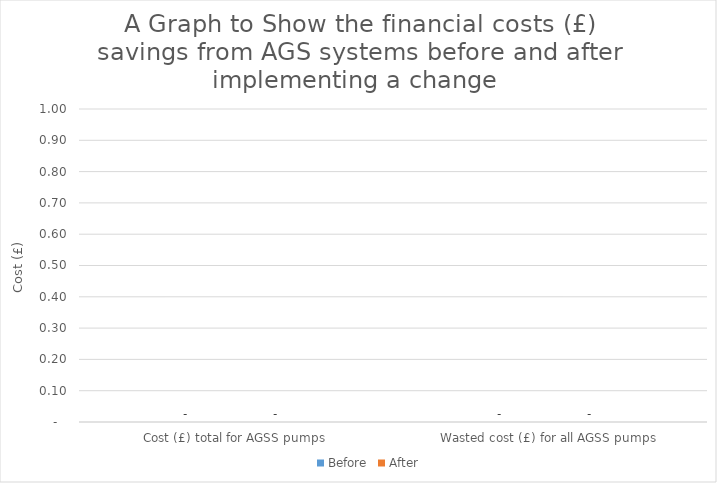
| Category | Before | After |
|---|---|---|
| Cost (£) total for AGSS pumps | 0 | 0 |
| Wasted cost (£) for all AGSS pumps | 0 | 0 |